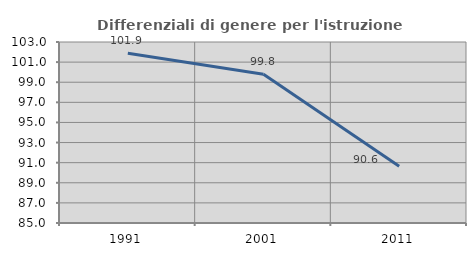
| Category | Differenziali di genere per l'istruzione superiore |
|---|---|
| 1991.0 | 101.89 |
| 2001.0 | 99.798 |
| 2011.0 | 90.632 |